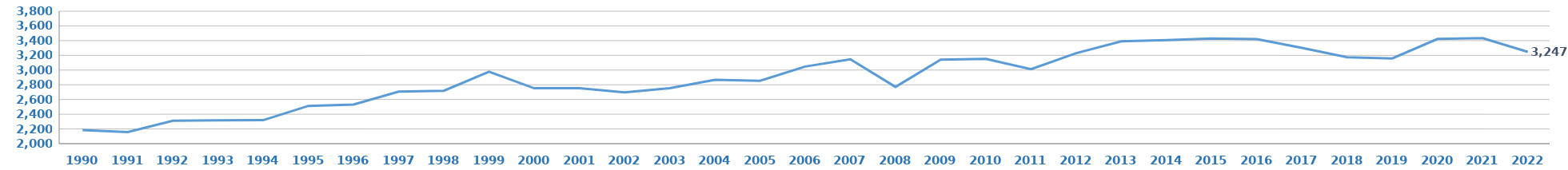
| Category | DNB |
|---|---|
| 1990.0 | 2183 |
| 1991.0 | 2158 |
| 1992.0 | 2312 |
| 1993.0 | 2316 |
| 1994.0 | 2319 |
| 1995.0 | 2513 |
| 1996.0 | 2531 |
| 1997.0 | 2707 |
| 1998.0 | 2719 |
| 1999.0 | 2978 |
| 2000.0 | 2753 |
| 2001.0 | 2753 |
| 2002.0 | 2696 |
| 2003.0 | 2753 |
| 2004.0 | 2867 |
| 2005.0 | 2854 |
| 2006.0 | 3048 |
| 2007.0 | 3147 |
| 2008.0 | 2771 |
| 2009.0 | 3142 |
| 2010.0 | 3153 |
| 2011.0 | 3011 |
| 2012.0 | 3230 |
| 2013.0 | 3391 |
| 2014.0 | 3408 |
| 2015.0 | 3429 |
| 2016.0 | 3421 |
| 2017.0 | 3302 |
| 2018.0 | 3173 |
| 2019.0 | 3158 |
| 2020.0 | 3423 |
| 2021.0 | 3434 |
| 2022.0 | 3247 |